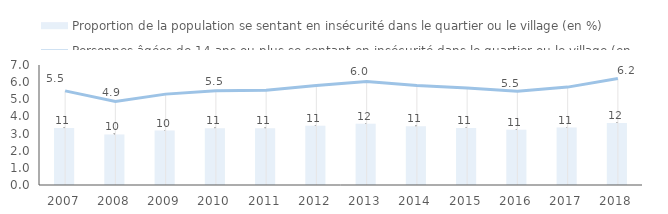
| Category | Proportion de la population se sentant en insécurité dans le quartier ou le village (en %) |
|---|---|
| 2007.0 | 10.91 |
| 2008.0 | 9.68 |
| 2009.0 | 10.44 |
| 2010.0 | 10.88 |
| 2011.0 | 10.86 |
| 2012.0 | 11.36 |
| 2013.0 | 11.75 |
| 2014.0 | 11.24 |
| 2015.0 | 10.94 |
| 2016.0 | 10.57 |
| 2017.0 | 11.02 |
| 2018.0 | 11.9 |